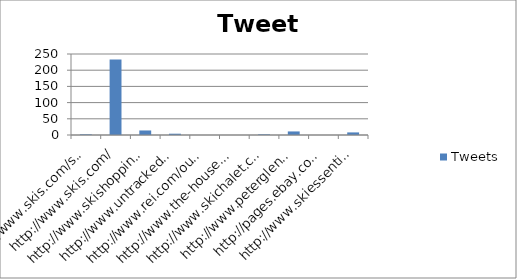
| Category | Tweets |
|---|---|
| http://www.skis.com/ski-equipment/c9/ | 2 |
| http://www.skis.com/ | 233 |
| http://www.skishoppingguide.com/ | 14 |
| http://www.untracked.com/ | 4 |
| http://www.rei.com/outlet/category/22000078 | 0 |
| http://www.the-house.com/skis.html | 0 |
| http://www.skichalet.com/ | 2 |
| http://www.peterglenn.com/ | 11 |
| http://pages.ebay.com/buy/guides/skis-skiing-equipment-buying-guide/ | 0 |
| http://www.skiessentials.com/ | 8 |